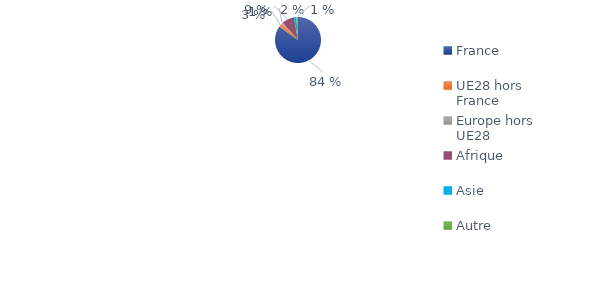
| Category | Series 0 |
|---|---|
| France | 0.84 |
| UE28 hors France | 0.026 |
| Europe hors UE28 | 0.009 |
| Afrique | 0.086 |
| Asie | 0.017 |
| Autre | 0.011 |